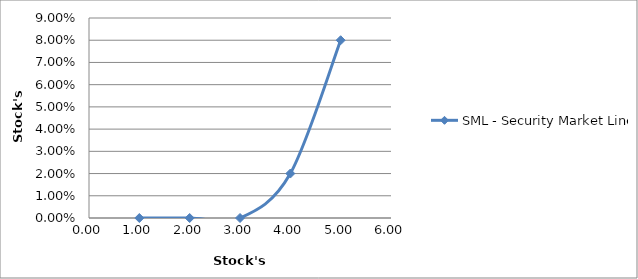
| Category | SML - Security Market Line |
|---|---|
| 0 | 0 |
| 1 | 0 |
| 2 | 0 |
| 3 | 0.02 |
| 4 | 0.08 |